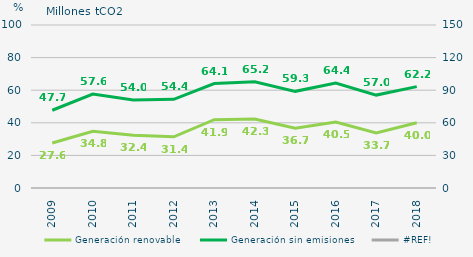
| Category | Generación renovable | Generación sin emisiones |
|---|---|---|
| 2009.0 | 27.6 | 47.7 |
| 2010.0 | 34.8 | 57.6 |
| 2011.0 | 32.4 | 54 |
| 2012.0 | 31.4 | 54.4 |
| 2013.0 | 41.9 | 64.1 |
| 2014.0 | 42.3 | 65.2 |
| 2015.0 | 36.7 | 59.3 |
| 2016.0 | 40.5 | 64.4 |
| 2017.0 | 33.7 | 57 |
| 2018.0 | 40 | 62.2 |